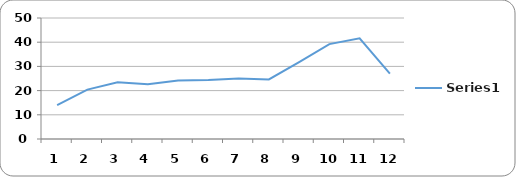
| Category | Series 0 |
|---|---|
| 0 | 14 |
| 1 | 20.4 |
| 2 | 23.4 |
| 3 | 22.6 |
| 4 | 24.2 |
| 5 | 24.4 |
| 6 | 25 |
| 7 | 24.6 |
| 8 | 31.8 |
| 9 | 39.2 |
| 10 | 41.6 |
| 11 | 27 |